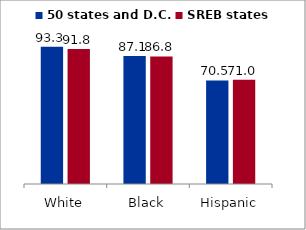
| Category | 50 states and D.C. | SREB states |
|---|---|---|
| White | 93.31 | 91.796 |
| Black | 87.059 | 86.764 |
| Hispanic | 70.456 | 70.995 |